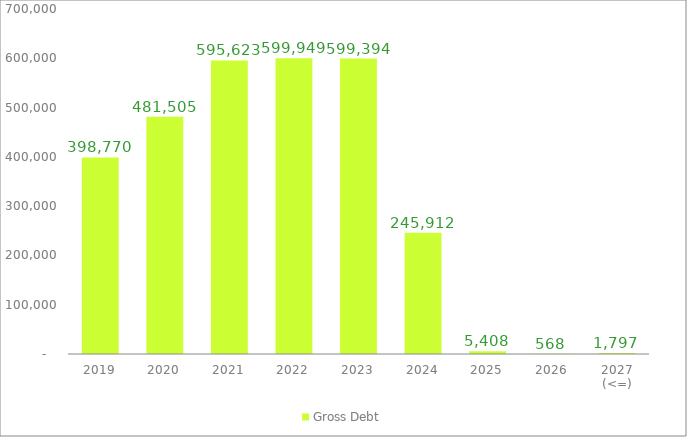
| Category | Gross Debt |
|---|---|
| 2019 | 398769.942 |
| 2020 | 481505.441 |
| 2021 | 595622.514 |
| 2022 | 599948.663 |
| 2023 | 599394.04 |
| 2024 | 245911.96 |
| 2025 | 5407.91 |
| 2026 | 567.533 |
| 2027 (<=) | 1797.188 |